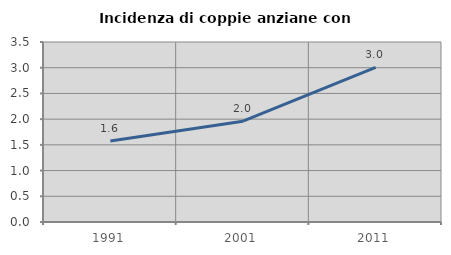
| Category | Incidenza di coppie anziane con figli |
|---|---|
| 1991.0 | 1.575 |
| 2001.0 | 1.96 |
| 2011.0 | 3.009 |